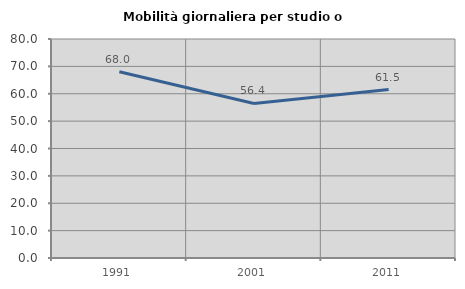
| Category | Mobilità giornaliera per studio o lavoro |
|---|---|
| 1991.0 | 68.039 |
| 2001.0 | 56.445 |
| 2011.0 | 61.529 |